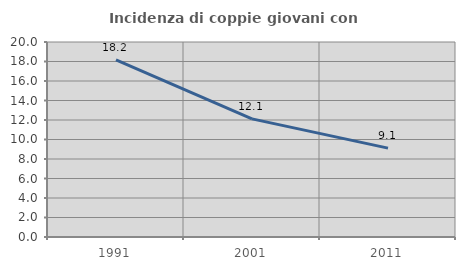
| Category | Incidenza di coppie giovani con figli |
|---|---|
| 1991.0 | 18.167 |
| 2001.0 | 12.113 |
| 2011.0 | 9.115 |